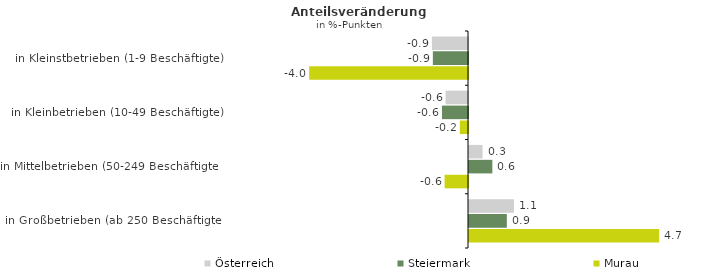
| Category | Österreich | Steiermark | Murau |
|---|---|---|---|
| in Kleinstbetrieben (1-9 Beschäftigte) | -0.898 | -0.875 | -3.953 |
| in Kleinbetrieben (10-49 Beschäftigte) | -0.559 | -0.648 | -0.203 |
| in Mittelbetrieben (50-249 Beschäftigte) | 0.338 | 0.581 | -0.583 |
| in Großbetrieben (ab 250 Beschäftigte) | 1.12 | 0.942 | 4.735 |